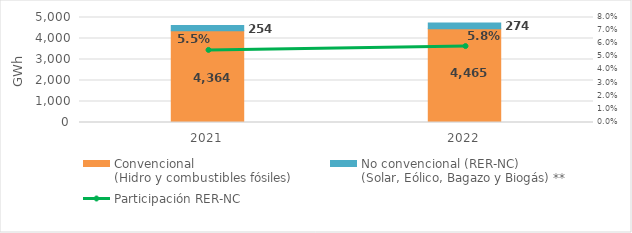
| Category | Convencional
(Hidro y combustibles fósiles) | No convencional (RER-NC)
(Solar, Eólico, Bagazo y Biogás) ** |
|---|---|---|
| 2021.0 | 4363.728 | 253.621 |
| 2022.0 | 4465.111 | 274.21 |